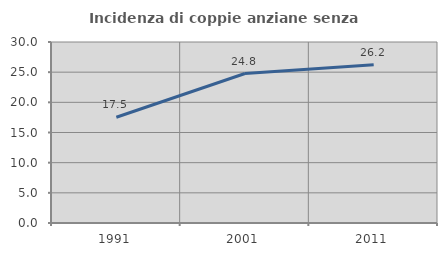
| Category | Incidenza di coppie anziane senza figli  |
|---|---|
| 1991.0 | 17.53 |
| 2001.0 | 24.779 |
| 2011.0 | 26.23 |